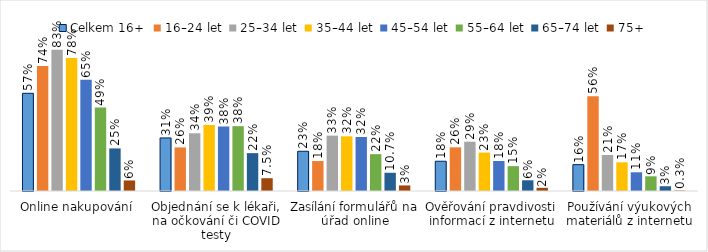
| Category | Celkem 16+ | 16–24 let | 25–34 let | 35–44 let | 45–54 let | 55–64 let | 65–74 let | 75+ |
|---|---|---|---|---|---|---|---|---|
| Online nakupování | 0.575 | 0.735 | 0.832 | 0.782 | 0.654 | 0.491 | 0.25 | 0.062 |
| Objednání se k lékaři, na očkování či COVID testy | 0.312 | 0.256 | 0.34 | 0.388 | 0.379 | 0.381 | 0.223 | 0.075 |
| Zasílání formulářů na úřad online | 0.234 | 0.176 | 0.326 | 0.322 | 0.318 | 0.217 | 0.107 | 0.033 |
| Ověřování pravdivosti informací z internetu | 0.175 | 0.257 | 0.29 | 0.226 | 0.177 | 0.146 | 0.063 | 0.019 |
| Používání výukových materiálů z internetu | 0.155 | 0.557 | 0.212 | 0.169 | 0.11 | 0.087 | 0.028 | 0.003 |